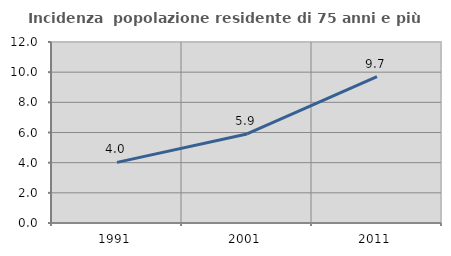
| Category | Incidenza  popolazione residente di 75 anni e più |
|---|---|
| 1991.0 | 4.017 |
| 2001.0 | 5.901 |
| 2011.0 | 9.709 |